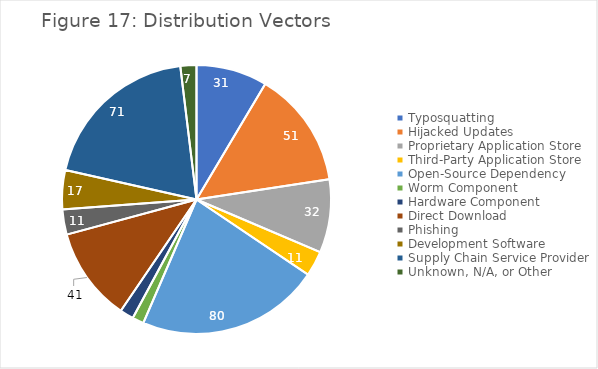
| Category | Series 0 |
|---|---|
| Typosquatting | 31 |
| Hijacked Updates | 51 |
| Proprietary Application Store | 32 |
| Third-Party Application Store | 11 |
| Open-Source Dependency | 80 |
| Worm Component | 5 |
| Hardware Component | 6 |
| Direct Download | 41 |
| Phishing | 11 |
| Development Software | 17 |
| Supply Chain Service Provider | 71 |
| Unknown, N/A, or Other | 7 |